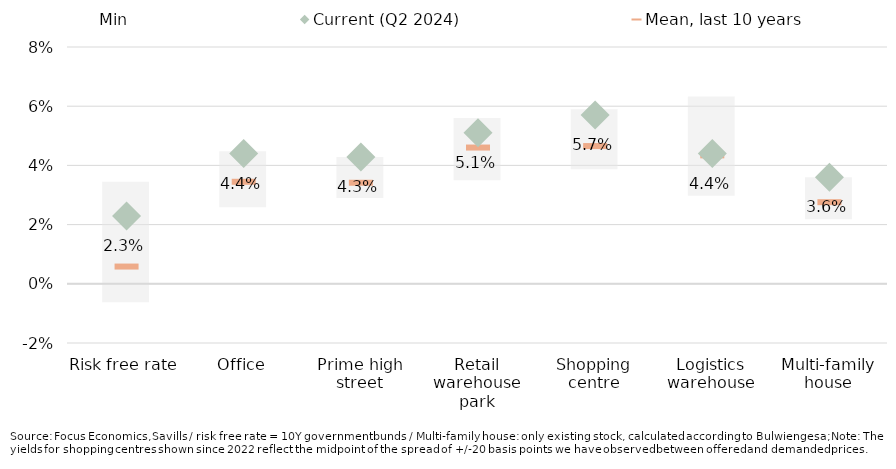
| Category | Min | Range min/max, last 10 years |
|---|---|---|
| Risk free rate | -0.006 | 0.034 |
| Office | 0.026 | 0.019 |
| Prime high street | 0.029 | 0.014 |
| Retail warehouse park | 0.035 | 0.021 |
| Shopping centre | 0.039 | 0.02 |
| Logistics warehouse | 0.03 | 0.034 |
| Multi-family house | 0.022 | 0.014 |